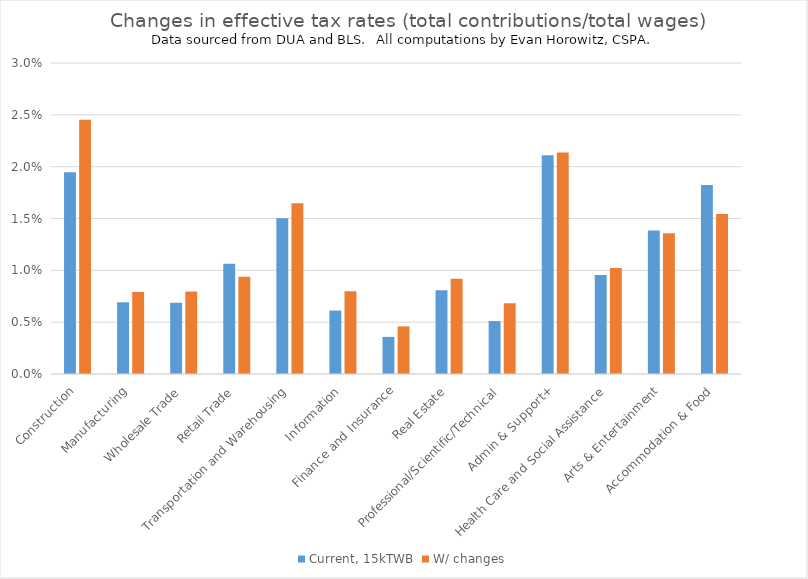
| Category | Current, 15kTWB | W/ changes |
|---|---|---|
| Construction | 0.019 | 0.025 |
| Manufacturing | 0.007 | 0.008 |
| Wholesale Trade | 0.007 | 0.008 |
| Retail Trade | 0.011 | 0.009 |
| Transportation and Warehousing | 0.015 | 0.016 |
| Information | 0.006 | 0.008 |
| Finance and Insurance | 0.004 | 0.005 |
| Real Estate | 0.008 | 0.009 |
| Professional/Scientific/Technical | 0.005 | 0.007 |
| Admin & Support+ | 0.021 | 0.021 |
| Health Care and Social Assistance | 0.01 | 0.01 |
| Arts & Entertainment | 0.014 | 0.014 |
| Accommodation & Food | 0.018 | 0.015 |